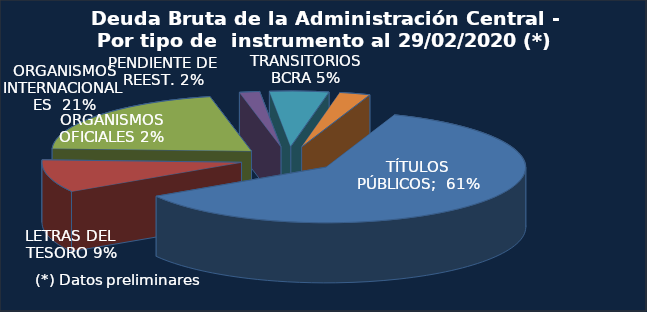
| Category | Series 0 |
|---|---|
| TÍTULOS PÚBLICOS | 195788.4 |
| LETRAS DEL TESORO | 30573.2 |
| ORGANISMOS INTERNACIONALES | 67604.4 |
| ORGANISMOS OFICIALES | 5270 |
| ADELANTOS TRANSITORIOS BCRA | 15427.8 |
| OTROS Y PENDIENTE DE REEST. | 7985.3 |